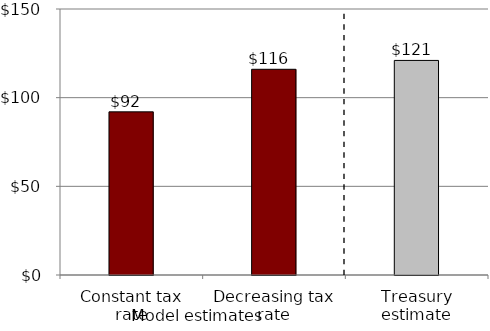
| Category | Series 0 |
|---|---|
| Constant tax rate | 92 |
| Decreasing tax rate | 116 |
| Treasury estimate | 121 |